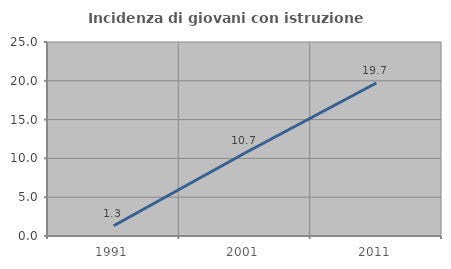
| Category | Incidenza di giovani con istruzione universitaria |
|---|---|
| 1991.0 | 1.316 |
| 2001.0 | 10.695 |
| 2011.0 | 19.714 |